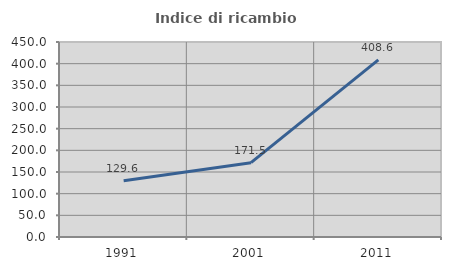
| Category | Indice di ricambio occupazionale  |
|---|---|
| 1991.0 | 129.592 |
| 2001.0 | 171.48 |
| 2011.0 | 408.602 |